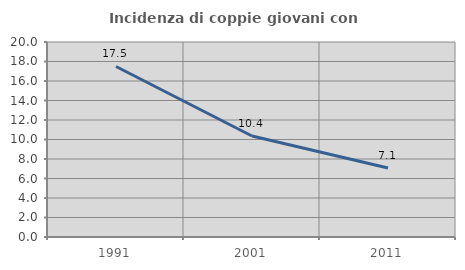
| Category | Incidenza di coppie giovani con figli |
|---|---|
| 1991.0 | 17.488 |
| 2001.0 | 10.358 |
| 2011.0 | 7.073 |